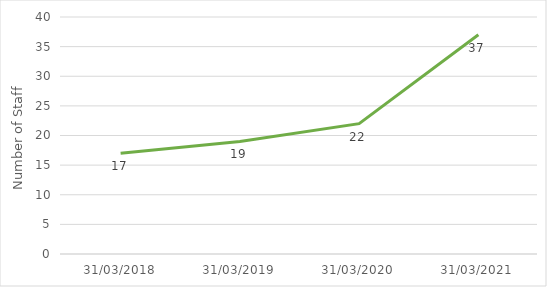
| Category | Total |
|---|---|
| 31/03/2018 | 17 |
| 31/03/2019 | 19 |
| 31/03/2020 | 22 |
| 31/03/2021 | 37 |